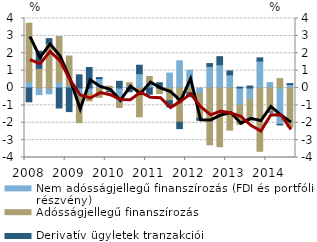
| Category | Nem adósságjellegű finanszírozás (FDI és portfólió részvény) | Adósságjellegű finanszírozás | Derivatív ügyletek tranzakciói |
|---|---|---|---|
| 2008.0 | 0.348 | 3.381 | -0.797 |
| 2008.0 | -0.385 | 1.131 | 0.986 |
| 2008.0 | -0.338 | 2.551 | 0.292 |
| 2008.0 | 0.334 | 2.628 | -1.152 |
| 2009.0 | 0.125 | 1.714 | -1.358 |
| 2009.0 | -0.495 | -1.502 | 0.758 |
| 2009.0 | -0.31 | -0.426 | 1.181 |
| 2009.0 | 0.54 | -0.537 | 0.06 |
| 2010.0 | -0.188 | 0.108 | -0.028 |
| 2010.0 | -0.819 | -0.301 | 0.384 |
| 2010.0 | 0.167 | 0.134 | -0.216 |
| 2010.0 | 0.825 | -1.656 | 0.485 |
| 2011.0 | 0.28 | 0.384 | -0.362 |
| 2011.0 | -0.045 | -0.279 | 0.301 |
| 2011.0 | 0.858 | -0.734 | -0.355 |
| 2011.0 | 1.566 | -1.967 | -0.372 |
| 2012.0 | 1.021 | -0.271 | -0.233 |
| 2012.0 | -0.32 | -1.424 | -0.117 |
| 2012.0 | 1.246 | -3.273 | 0.16 |
| 2012.0 | 1.341 | -3.383 | 0.463 |
| 2013.0 | 0.755 | -2.426 | 0.228 |
| 2013.0 | -0.965 | -1.135 | 0.053 |
| 2013.0 | -0.64 | -1.251 | 0.112 |
| 2013.0 | 1.548 | -3.643 | 0.185 |
| 2014.0 | 0.307 | -1.378 | -0.016 |
| 2014.0 | -2.092 | 0.54 | -0.034 |
| 2014.0 | 0.197 | -2.248 | 0.059 |